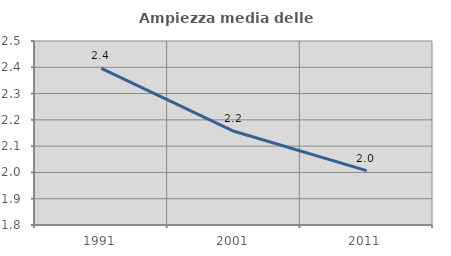
| Category | Ampiezza media delle famiglie |
|---|---|
| 1991.0 | 2.396 |
| 2001.0 | 2.157 |
| 2011.0 | 2.007 |